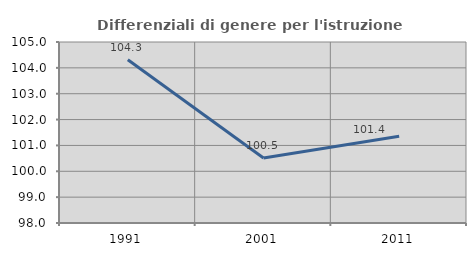
| Category | Differenziali di genere per l'istruzione superiore |
|---|---|
| 1991.0 | 104.315 |
| 2001.0 | 100.514 |
| 2011.0 | 101.357 |